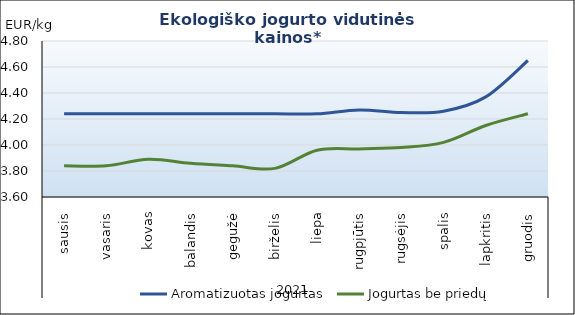
| Category | Aromatizuotas jogurtas | Jogurtas be priedų |
|---|---|---|
| 0 | 4.24 | 3.84 |
| 1 | 4.24 | 3.84 |
| 2 | 4.24 | 3.89 |
| 3 | 4.24 | 3.86 |
| 4 | 4.24 | 3.84 |
| 5 | 4.24 | 3.82 |
| 6 | 4.24 | 3.96 |
| 7 | 4.27 | 3.97 |
| 8 | 4.25 | 3.98 |
| 9 | 4.26 | 4.02 |
| 10 | 4.37 | 4.15 |
| 11 | 4.65 | 4.24 |